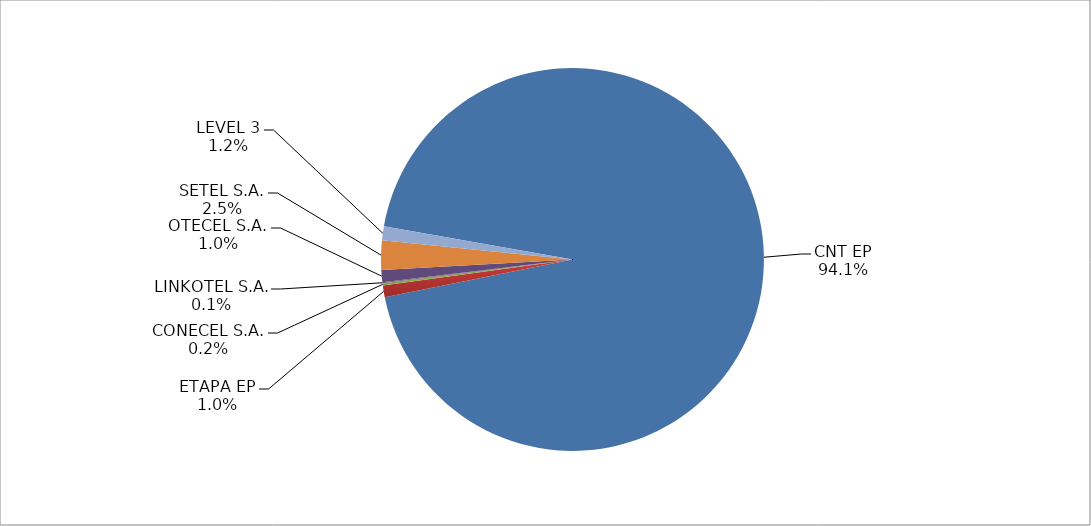
| Category | Series 0 |
|---|---|
| CNT EP | 2473 |
| ETAPA EP | 26 |
| CONECEL S.A. | 5 |
| LINKOTEL S.A. | 2 |
| OTECEL S.A. | 27 |
| SETEL S.A. | 65 |
| LEVEL 3 | 31 |